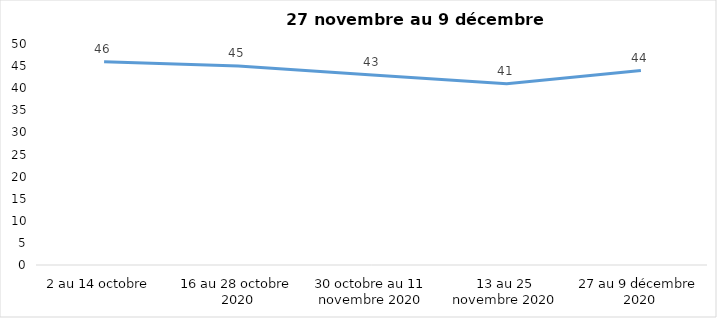
| Category | Series 0 |
|---|---|
| 2 au 14 octobre  | 46 |
| 16 au 28 octobre 2020 | 45 |
| 30 octobre au 11 novembre 2020 | 43 |
| 13 au 25 novembre 2020 | 41 |
| 27 au 9 décembre 2020 | 44 |